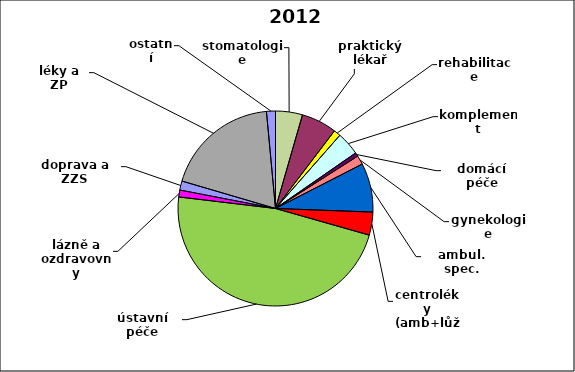
| Category | Series 0 |
|---|---|
| stomatologie | 0.045 |
| praktický lékař | 0.059 |
| rehabilitace | 0.011 |
| komplement | 0.039 |
| domácí péče | 0.006 |
| gynekologie | 0.015 |
| ambul. spec. | 0.081 |
| centroléky (amb+lůž) | 0.038 |
| ústavní péče | 0.475 |
| lázně a ozdravovny | 0.011 |
| doprava a ZZS | 0.015 |
| léky a ZP | 0.19 |
| ostatní | 0.015 |